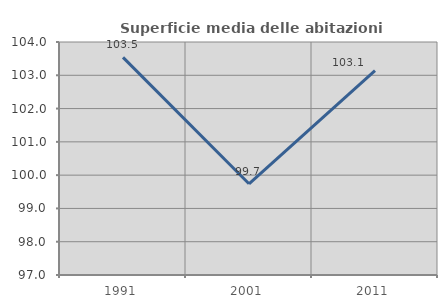
| Category | Superficie media delle abitazioni occupate |
|---|---|
| 1991.0 | 103.539 |
| 2001.0 | 99.741 |
| 2011.0 | 103.141 |